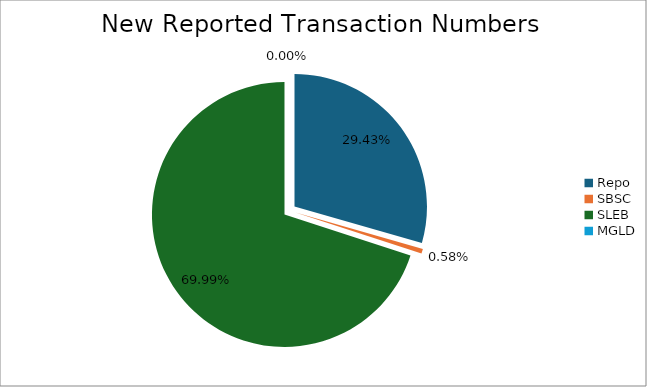
| Category | Series 0 |
|---|---|
| Repo | 356982 |
| SBSC | 7037 |
| SLEB | 848934 |
| MGLD | 20 |